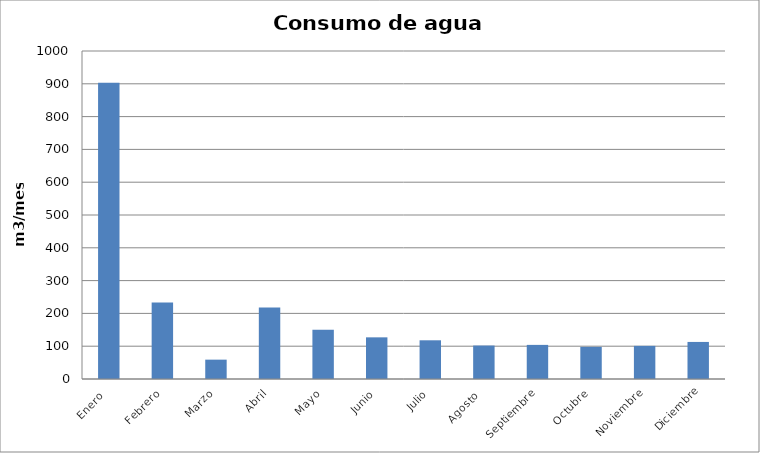
| Category | Series 0 |
|---|---|
| Enero  | 903 |
| Febrero | 233 |
| Marzo | 59 |
| Abril | 218 |
| Mayo | 150 |
| Junio | 127 |
| Julio | 118 |
| Agosto  | 102 |
| Septiembre | 104 |
| Octubre | 98 |
| Noviembre | 101 |
| Diciembre | 113 |